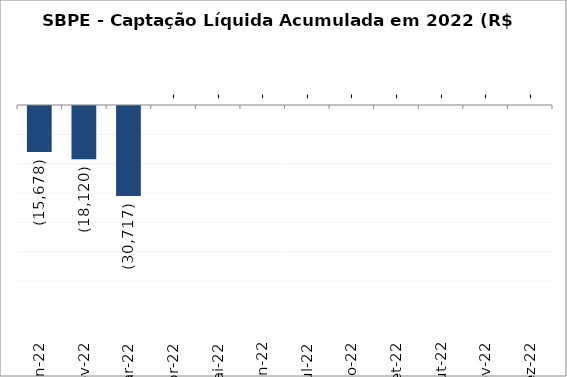
| Category | SBPE - Captação Líquida Acumulada em 2022 (R$ Milhões)  |
|---|---|
| Jan-22 | -15677.697 |
| Fev-22 | -18120.272 |
| Mar-22 | -30717.118 |
| Abr-22 | 0 |
| Mai-22 | 0 |
| Jun-22 | 0 |
| Jul-22 | 0 |
| Ago-22 | 0 |
| Set-22 | 0 |
| Out-22 | 0 |
| Nov-22 | 0 |
| Dez-22 | 0 |